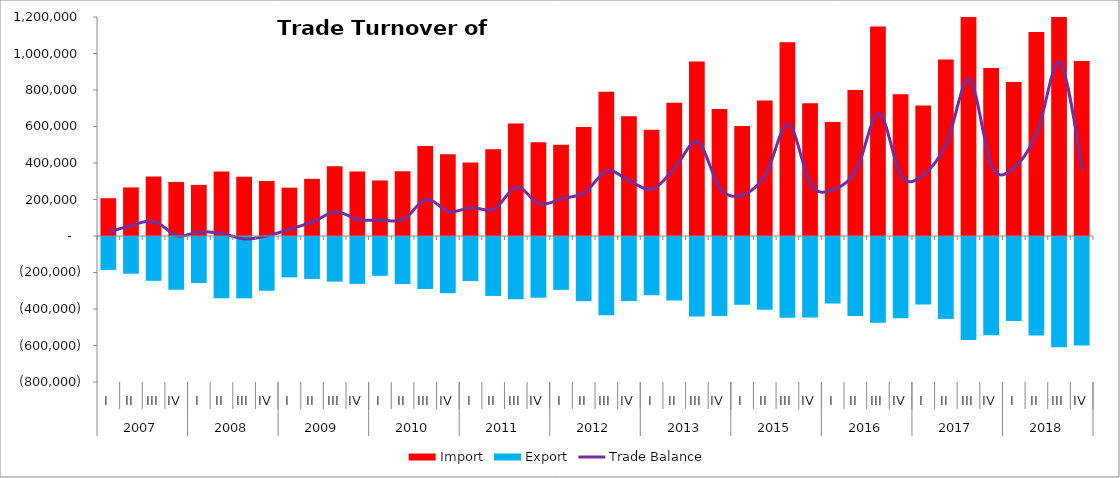
| Category | Import | Export |
|---|---|---|
| 0 | 206876.453 | -185862.119 |
| 1 | 266162.034 | -206602.171 |
| 2 | 325432.039 | -245424.789 |
| 3 | 295638.902 | -295030.919 |
| 4 | 280196.682 | -257248.178 |
| 5 | 354066.036 | -340846.499 |
| 6 | 324889.482 | -341447.222 |
| 7 | 301301.793 | -299882.459 |
| 8 | 264903.998 | -226561.536 |
| 9 | 313311.481 | -235037.426 |
| 10 | 382383.207 | -249991.263 |
| 11 | 353010.364 | -262293.067 |
| 12 | 304483.789 | -217879.02 |
| 13 | 354263.8 | -263232.936 |
| 14 | 492599.694 | -290888.678 |
| 15 | 447423.972 | -313316.693 |
| 16 | 402433.78 | -247232.2 |
| 17 | 475906.544 | -328431.291 |
| 18 | 616171.319 | -347095.2 |
| 19 | 513645.707 | -337933.603 |
| 20 | 499607.449 | -295085.361 |
| 21 | 596895.347 | -358072.392 |
| 22 | 791093.658 | -433796.826 |
| 23 | 656411.742 | -355854.896 |
| 24 | 582176.614 | -325310.604 |
| 25 | 729496.889 | -354020.424 |
| 26 | 956513.447 | -441031.269 |
| 27 | 695845.992 | -438198.975 |
| 28 | 602133.659 | -376572.246 |
| 29 | 742725.876 | -404597.572 |
| 30 | 1061185.775 | -447435.407 |
| 31 | 727096.737 | -446754.878 |
| 32 | 624569.616 | -370507.095 |
| 33 | 799859.375 | -438638.214 |
| 34 | 1147701.128 | -474916.674 |
| 35 | 776931.366 | -451354.128 |
| 36 | 714491.312 | -375970.87 |
| 37 | 967042.006 | -455164.095 |
| 38 | 1427808.272 | -569946.006 |
| 39 | 920988.9 | -543215 |
| 40 | 844143.887 | -465841.79 |
| 41 | 1117607.587 | -545310.986 |
| 42 | 1560170.948 | -610067.636 |
| 43 | 958624.877 | -600069.274 |